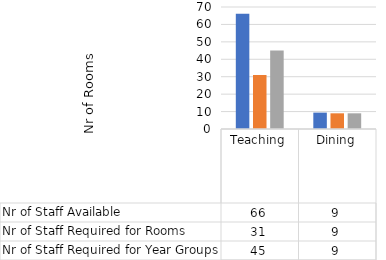
| Category | Nr of Staff Available | Nr of Staff Required for Rooms | Nr of Staff Required for Year Groups |
|---|---|---|---|
| Teaching | 66.1 | 31 | 45 |
| Dining | 9.4 | 9 | 9 |